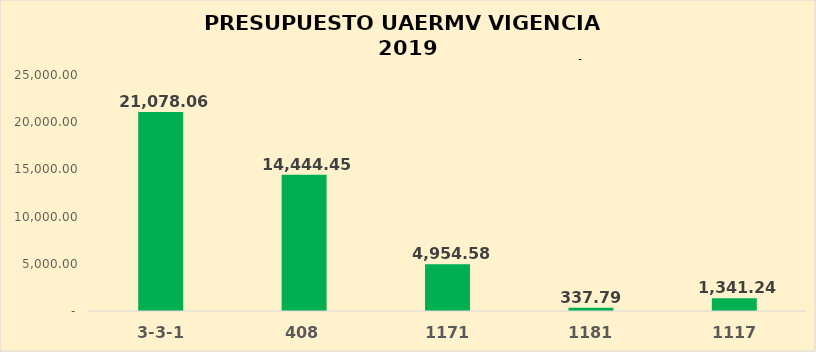
| Category | Series 0 |
|---|---|
| 3-3-1 | 21078.055 |
| 408 | 14444.448 |
| 1171 | 4954.578 |
| 1181 | 337.79 |
| 1117 | 1341.24 |